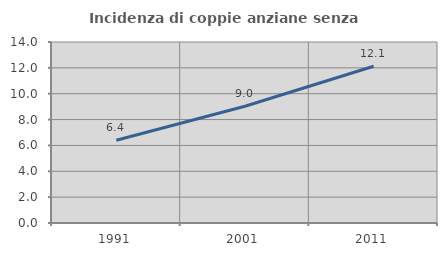
| Category | Incidenza di coppie anziane senza figli  |
|---|---|
| 1991.0 | 6.398 |
| 2001.0 | 9.027 |
| 2011.0 | 12.123 |